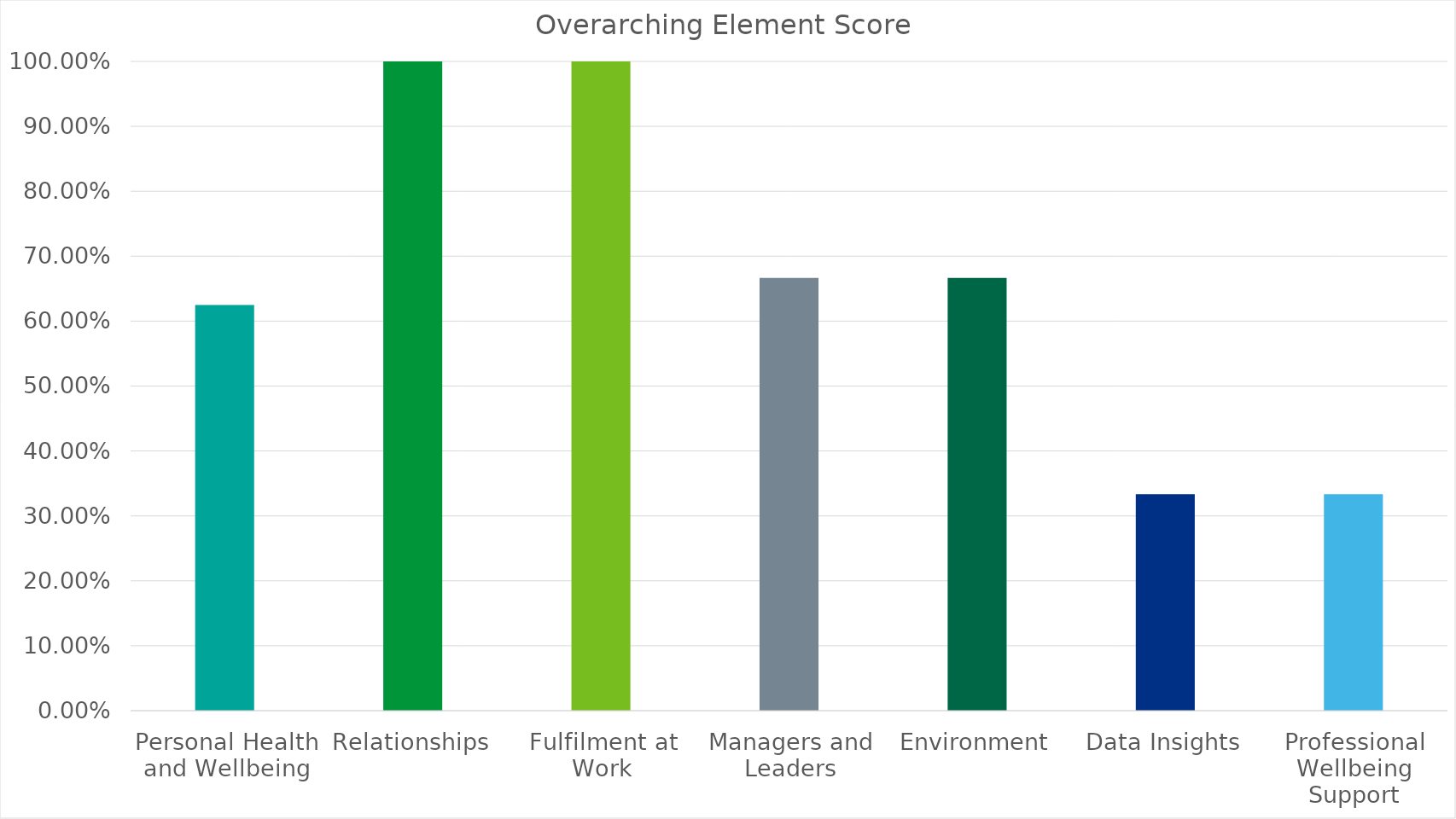
| Category | Series 0 |
|---|---|
| Personal Health and Wellbeing | 0.625 |
| Relationships | 1 |
| Fulfilment at Work | 1 |
| Managers and Leaders | 0.667 |
| Environment | 0.667 |
| Data Insights | 0.333 |
| Professional Wellbeing Support | 0.333 |